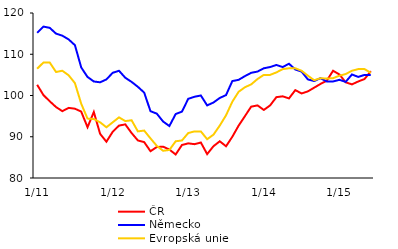
| Category | ČR | Německo | Evropská unie |
|---|---|---|---|
|  1/11 | 102.6 | 115.2 | 106.5 |
| 2 | 100.1 | 116.7 | 108 |
| 3 | 98.6 | 116.4 | 108 |
| 4 | 97.2 | 115 | 105.7 |
| 5 | 96.2 | 114.5 | 106 |
| 6 | 97 | 113.6 | 104.9 |
| 7 | 96.8 | 112.2 | 103 |
| 8 | 96.1 | 106.8 | 98 |
| 9 | 92.3 | 104.5 | 94.4 |
| 10 | 96 | 103.4 | 94.3 |
| 11 | 90.7 | 103.2 | 93.5 |
| 12 | 88.8 | 103.9 | 92.3 |
|  1/12 | 91.2 | 105.5 | 93.5 |
| 2 | 92.7 | 106 | 94.7 |
| 3 | 93 | 104.3 | 93.8 |
| 4 | 90.9 | 103.3 | 94 |
| 5 | 89.1 | 102.1 | 91.3 |
| 6 | 88.7 | 100.7 | 91.5 |
| 7 | 86.5 | 96.2 | 89.6 |
| 8 | 87.5 | 95.6 | 87.8 |
| 9 | 87.6 | 93.7 | 86.6 |
| 10 | 86.9 | 92.6 | 86.8 |
| 11 | 85.7 | 95.5 | 88.9 |
| 12 | 88 | 96.1 | 89.1 |
|  1/13 | 88.4 | 99.2 | 90.9 |
| 2 | 88.2 | 99.7 | 91.3 |
| 3 | 88.6 | 100 | 91.3 |
| 4 | 85.8 | 97.6 | 89.4 |
| 5 | 87.7 | 98.3 | 90.5 |
| 6 | 88.9 | 99.4 | 92.7 |
| 7 | 87.7 | 100.1 | 95.2 |
| 8 | 90 | 103.5 | 98.5 |
| 9 | 92.7 | 103.8 | 100.9 |
| 10 | 95 | 104.7 | 102 |
| 11 | 97.3 | 105.5 | 102.7 |
| 12 | 97.6 | 105.8 | 104 |
|  1/14 | 96.5 | 106.6 | 105 |
| 2 | 97.6 | 106.9 | 105 |
| 3 | 99.6 | 107.4 | 105.6 |
| 4 | 99.8 | 106.9 | 106.4 |
| 5 | 99.3 | 107.7 | 106.6 |
| 6 | 101.3 | 106.3 | 106.6 |
| 7 | 100.5 | 105.8 | 106 |
| 8 | 101 | 103.9 | 104.8 |
| 9 | 101.9 | 103.5 | 103.7 |
| 10 | 102.8 | 104.2 | 104.2 |
| 11 | 103.6 | 103.4 | 104.1 |
| 12 | 106 | 103.4 | 104.2 |
|  1/15 | 105.1 | 103.8 | 104.8 |
| 2 | 103.2 | 103.3 | 105.2 |
| 3 | 102.7 | 105.1 | 106 |
| 4 | 103.4 | 104.5 | 106.4 |
| 5 | 104 | 105 | 106.4 |
| 6 | 105.9 | 105 | 105.5 |